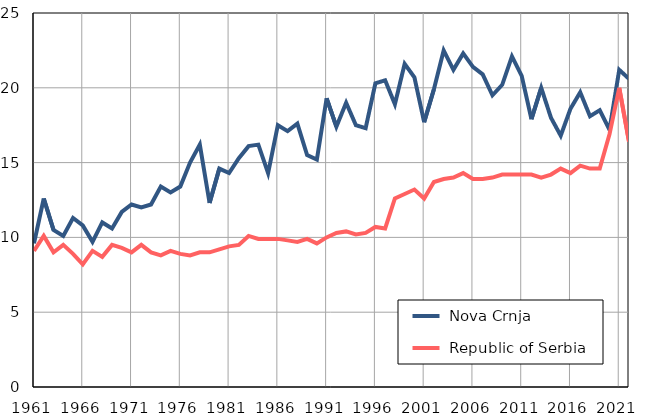
| Category |  Nova Crnja |  Republic of Serbia |
|---|---|---|
| 1961.0 | 9.6 | 9.1 |
| 1962.0 | 12.6 | 10.1 |
| 1963.0 | 10.5 | 9 |
| 1964.0 | 10.1 | 9.5 |
| 1965.0 | 11.3 | 8.9 |
| 1966.0 | 10.8 | 8.2 |
| 1967.0 | 9.7 | 9.1 |
| 1968.0 | 11 | 8.7 |
| 1969.0 | 10.6 | 9.5 |
| 1970.0 | 11.7 | 9.3 |
| 1971.0 | 12.2 | 9 |
| 1972.0 | 12 | 9.5 |
| 1973.0 | 12.2 | 9 |
| 1974.0 | 13.4 | 8.8 |
| 1975.0 | 13 | 9.1 |
| 1976.0 | 13.4 | 8.9 |
| 1977.0 | 15 | 8.8 |
| 1978.0 | 16.2 | 9 |
| 1979.0 | 12.3 | 9 |
| 1980.0 | 14.6 | 9.2 |
| 1981.0 | 14.3 | 9.4 |
| 1982.0 | 15.3 | 9.5 |
| 1983.0 | 16.1 | 10.1 |
| 1984.0 | 16.2 | 9.9 |
| 1985.0 | 14.3 | 9.9 |
| 1986.0 | 17.5 | 9.9 |
| 1987.0 | 17.1 | 9.8 |
| 1988.0 | 17.6 | 9.7 |
| 1989.0 | 15.5 | 9.9 |
| 1990.0 | 15.2 | 9.6 |
| 1991.0 | 19.3 | 10 |
| 1992.0 | 17.4 | 10.3 |
| 1993.0 | 19 | 10.4 |
| 1994.0 | 17.5 | 10.2 |
| 1995.0 | 17.3 | 10.3 |
| 1996.0 | 20.3 | 10.7 |
| 1997.0 | 20.5 | 10.6 |
| 1998.0 | 18.9 | 12.6 |
| 1999.0 | 21.6 | 12.9 |
| 2000.0 | 20.7 | 13.2 |
| 2001.0 | 17.7 | 12.6 |
| 2002.0 | 19.9 | 13.7 |
| 2003.0 | 22.5 | 13.9 |
| 2004.0 | 21.2 | 14 |
| 2005.0 | 22.3 | 14.3 |
| 2006.0 | 21.4 | 13.9 |
| 2007.0 | 20.9 | 13.9 |
| 2008.0 | 19.5 | 14 |
| 2009.0 | 20.2 | 14.2 |
| 2010.0 | 22.1 | 14.2 |
| 2011.0 | 20.8 | 14.2 |
| 2012.0 | 17.9 | 14.2 |
| 2013.0 | 20 | 14 |
| 2014.0 | 18 | 14.2 |
| 2015.0 | 16.8 | 14.6 |
| 2016.0 | 18.6 | 14.3 |
| 2017.0 | 19.7 | 14.8 |
| 2018.0 | 18.1 | 14.6 |
| 2019.0 | 18.5 | 14.6 |
| 2020.0 | 17.2 | 16.9 |
| 2021.0 | 21.2 | 20 |
| 2022.0 | 20.6 | 16.4 |